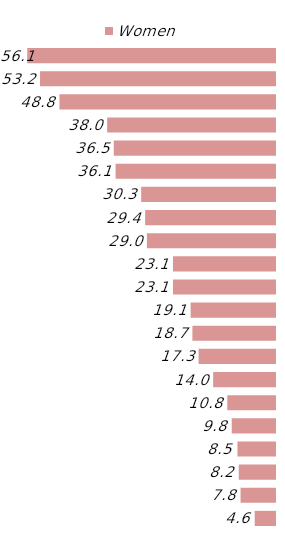
| Category | Women |
|---|---|
| Qatar | -4.6 |
| Palestine | -7.8 |
| Kuwait | -8.2 |
| UAE | -8.5 |
| Bahrain | -9.8 |
| Jordan | -10.8 |
| Lebanon | -14 |
| Libya | -17.3 |
| Saudi Arabia | -18.7 |
| Oman | -19.1 |
| Somalia | -23.1 |
| Syria | -23.1 |
| Tunisia | -29 |
| Iraq | -29.4 |
| Comoros | -30.3 |
| Algeria | -36.1 |
| Egypt | -36.5 |
| Sudan | -38 |
| Mauritania | -48.8 |
| Yemen | -53.2 |
| Morocco | -56.1 |